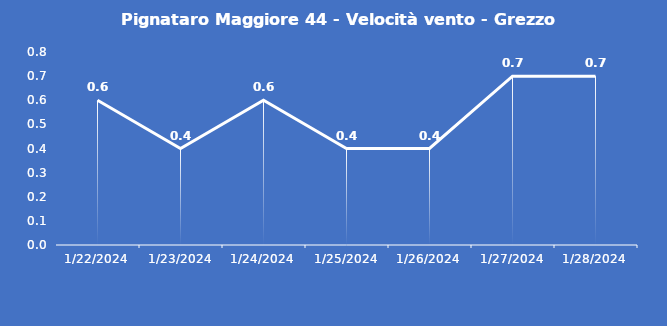
| Category | Pignataro Maggiore 44 - Velocità vento - Grezzo (m/s) |
|---|---|
| 1/22/24 | 0.6 |
| 1/23/24 | 0.4 |
| 1/24/24 | 0.6 |
| 1/25/24 | 0.4 |
| 1/26/24 | 0.4 |
| 1/27/24 | 0.7 |
| 1/28/24 | 0.7 |